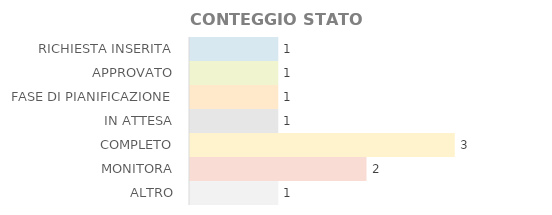
| Category | QT.À |
|---|---|
| RICHIESTA INSERITA | 1 |
| APPROVATO | 1 |
| FASE DI PIANIFICAZIONE | 1 |
| IN ATTESA | 1 |
| COMPLETO | 3 |
| MONITORA | 2 |
| ALTRO | 1 |